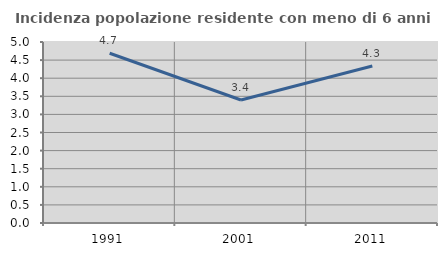
| Category | Incidenza popolazione residente con meno di 6 anni |
|---|---|
| 1991.0 | 4.689 |
| 2001.0 | 3.398 |
| 2011.0 | 4.336 |